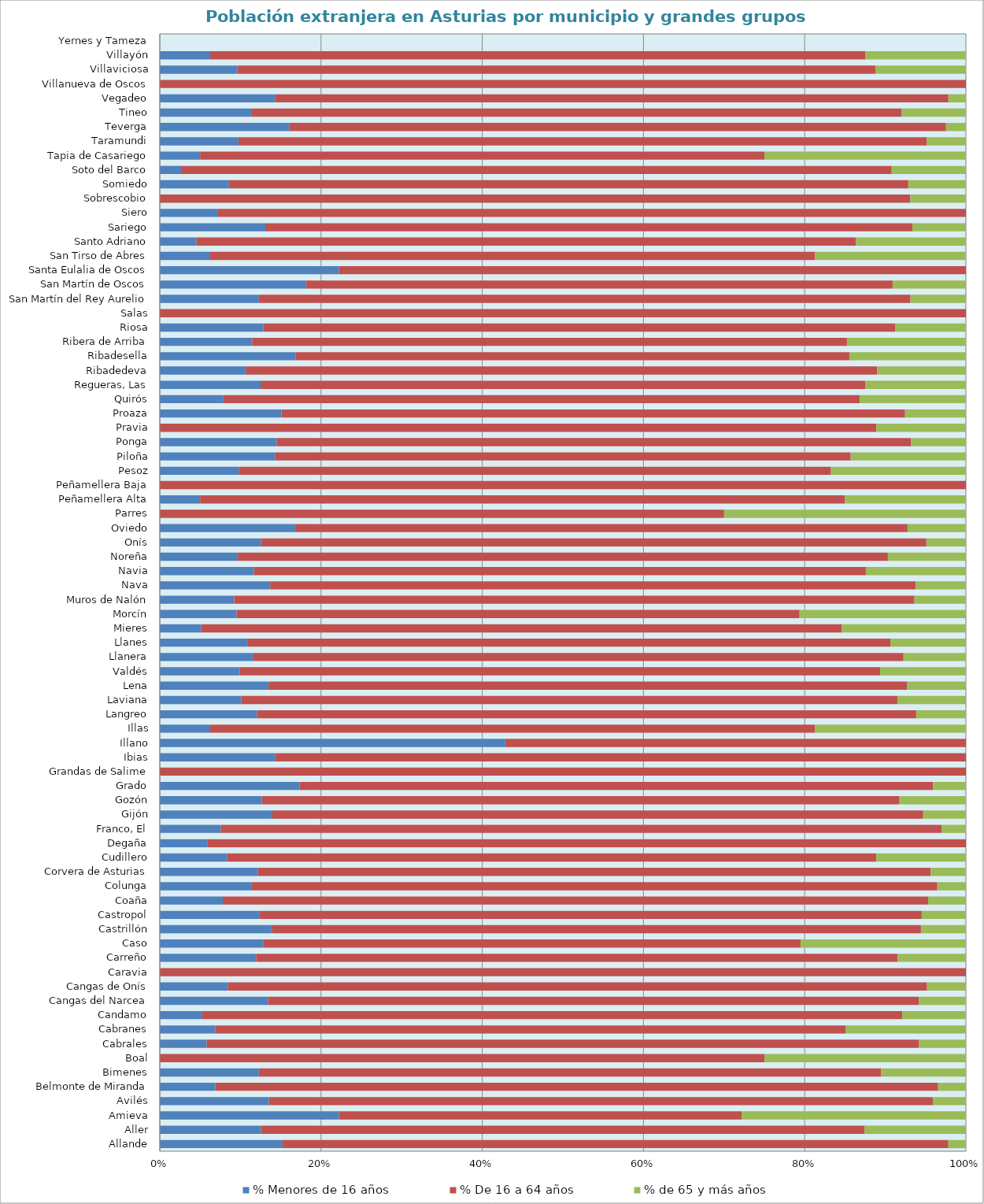
| Category | % Menores de 16 años | % De 16 a 64 años | % de 65 y más años |
|---|---|---|---|
| Allande | 7 | 38 | 1 |
| Aller | 32 | 191 | 32 |
| Amieva | 4 | 9 | 5 |
| Avilés | 425 | 2589 | 129 |
| Belmonte de Miranda | 2 | 26 | 1 |
| Bimenes | 7 | 44 | 6 |
| Boal | 0 | 9 | 3 |
| Cabrales | 5 | 76 | 5 |
| Cabranes | 6 | 68 | 13 |
| Candamo | 2 | 33 | 3 |
| Cangas del Narcea | 53 | 319 | 23 |
| Cangas de Onís | 28 | 288 | 16 |
| Caravia | 0 | 9 | 0 |
| Carreño | 41 | 273 | 29 |
| Caso | 5 | 26 | 8 |
| Castrillón | 70 | 404 | 28 |
| Castropol | 9 | 60 | 4 |
| Coaña | 5 | 56 | 3 |
| Colunga | 16 | 120 | 5 |
| Corvera de Asturias | 53 | 364 | 19 |
| Cudillero | 12 | 116 | 16 |
| Degaña | 1 | 16 | 0 |
| Franco, El | 5 | 59 | 2 |
| Gijón | 2034 | 11762 | 772 |
| Gozón | 32 | 200 | 21 |
| Grado | 85 | 385 | 20 |
| Grandas de Salime | 0 | 19 | 0 |
| Ibias | 5 | 30 | 0 |
| Illano | 6 | 8 | 0 |
| Illas | 1 | 12 | 3 |
| Langreo | 129 | 876 | 66 |
| Laviana | 25 | 201 | 21 |
| Lena | 39 | 229 | 21 |
| Valdés | 42 | 336 | 45 |
| Llanera | 72 | 500 | 48 |
| Llanes | 95 | 698 | 82 |
| Mieres | 4 | 62 | 12 |
| Morcín | 6 | 44 | 13 |
| Muros de Nalón | 13 | 119 | 9 |
| Nava | 33 | 193 | 15 |
| Navia | 16 | 104 | 17 |
| Noreña | 3 | 25 | 3 |
| Onís | 1776 | 11697 | 694 |
| Oviedo | 51 | 231 | 22 |
| Parres | 0 | 7 | 3 |
| Peñamellera Alta | 1 | 16 | 3 |
| Peñamellera Baja | 0 | 3 | 0 |
| Pesoz | 24 | 180 | 41 |
| Piloña | 1 | 5 | 1 |
| Ponga | 51 | 277 | 24 |
| Pravia | 0 | 8 | 1 |
| Proaza | 8 | 41 | 4 |
| Quirós | 3 | 30 | 5 |
| Regueras, Las | 6 | 36 | 6 |
| Ribadedeva | 27 | 199 | 28 |
| Ribadesella | 14 | 57 | 12 |
| Ribera de Arriba | 7 | 45 | 9 |
| Riosa | 19 | 116 | 13 |
| Salas | 0 | 3 | 0 |
| San Martín del Rey Aurelio | 50 | 329 | 28 |
| San Martín de Oscos | 2 | 8 | 1 |
| Santa Eulalia de Oscos | 6 | 21 | 0 |
| San Tirso de Abres | 1 | 12 | 3 |
| Santo Adriano | 1 | 18 | 3 |
| Sariego | 215 | 1319 | 109 |
| Siero | 1 | 13 | 0 |
| Sobrescobio | 0 | 27 | 2 |
| Somiedo | 6 | 59 | 5 |
| Soto del Barco | 2 | 67 | 7 |
| Tapia de Casariego | 1 | 14 | 5 |
| Taramundi | 4 | 35 | 2 |
| Teverga | 52 | 264 | 8 |
| Tineo | 33 | 233 | 23 |
| Vegadeo | 33 | 193 | 5 |
| Villanueva de Oscos | 0 | 2 | 0 |
| Villaviciosa | 62 | 510 | 72 |
| Villayón | 1 | 13 | 2 |
| Yernes y Tameza | 0 | 0 | 0 |